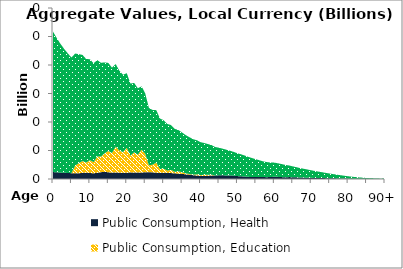
| Category | Public Consumption, Health | Public Consumption, Education | Public Consumption, Other than health and education |
|---|---|---|---|
| 0 | 1.221 | 0 | 24.641 |
|  | 1.171 | 0 | 23.57 |
| 2 | 1.126 | 0 | 22.611 |
| 3 | 1.087 | 0 | 21.753 |
| 4 | 1.067 | 0 | 20.986 |
| 5 | 1.02 | 0 | 20.3 |
| 6 | 1.003 | 1.318 | 19.684 |
| 7 | 1 | 1.787 | 19.128 |
| 8 | 1.085 | 2.061 | 18.621 |
| 9 | 1.122 | 1.768 | 18.153 |
| 10 | 1.057 | 2.241 | 17.725 |
| 11 | 1 | 1.965 | 17.337 |
| 12 | 1.085 | 2.858 | 16.922 |
| 13 | 1.2 | 2.738 | 16.449 |
| 14 | 1.243 | 3.277 | 15.94 |
| 15 | 1.183 | 3.729 | 15.45 |
| 16 | 1.115 | 3.448 | 14.967 |
| 17 | 1.148 | 4.529 | 14.489 |
| 18 | 1.109 | 3.857 | 14.021 |
| 19 | 1.1 | 3.636 | 13.558 |
| 20 | 1.094 | 4.378 | 13.097 |
| 21 | 1.166 | 2.923 | 12.647 |
| 22 | 1.13 | 3.562 | 12.172 |
| 23 | 1.146 | 3.115 | 11.655 |
| 24 | 1.144 | 4.003 | 11.118 |
| 25 | 1.182 | 3.258 | 10.595 |
| 26 | 1.207 | 1.177 | 10.077 |
| 27 | 1.164 | 1.351 | 9.605 |
| 28 | 1.111 | 1.762 | 9.203 |
| 29 | 1.07 | 0.695 | 8.852 |
| 30 | 1.099 | 0.703 | 8.508 |
| 31 | 1.073 | 0.415 | 8.179 |
| 32 | 1.035 | 0.565 | 7.863 |
| 33 | 1.012 | 0.234 | 7.554 |
| 34 | 0.924 | 0.412 | 7.255 |
| 35 | 0.903 | 0.274 | 6.973 |
| 36 | 0.815 | 0.174 | 6.706 |
| 37 | 0.766 | 0.107 | 6.454 |
| 38 | 0.671 | 0.092 | 6.216 |
| 39 | 0.618 | 0.197 | 5.99 |
| 40 | 0.562 | 0.126 | 5.774 |
| 41 | 0.538 | 0.212 | 5.567 |
| 42 | 0.571 | 0.186 | 5.371 |
| 43 | 0.618 | 0.14 | 5.186 |
| 44 | 0.595 | 0 | 5.01 |
| 45 | 0.651 | 0 | 4.839 |
| 46 | 0.644 | 0 | 4.674 |
| 47 | 0.627 | 0 | 4.509 |
| 48 | 0.62 | 0 | 4.341 |
| 49 | 0.58 | 0 | 4.172 |
| 50 | 0.509 | 0 | 4.008 |
| 51 | 0.473 | 0 | 3.853 |
| 52 | 0.43 | 0 | 3.685 |
| 53 | 0.374 | 0 | 3.498 |
| 54 | 0.363 | 0 | 3.301 |
| 55 | 0.366 | 0 | 3.11 |
| 56 | 0.365 | 0 | 2.917 |
| 57 | 0.332 | 0 | 2.754 |
| 58 | 0.326 | 0 | 2.638 |
| 59 | 0.338 | 0 | 2.552 |
| 60 | 0.405 | 0 | 2.465 |
| 61 | 0.373 | 0 | 2.383 |
| 62 | 0.33 | 0 | 2.289 |
| 63 | 0.303 | 0 | 2.17 |
| 64 | 0.335 | 0 | 2.036 |
| 65 | 0.31 | 0 | 1.908 |
| 66 | 0.29 | 0 | 1.784 |
| 67 | 0.25 | 0 | 1.663 |
| 68 | 0.242 | 0 | 1.548 |
| 69 | 0.221 | 0 | 1.437 |
| 70 | 0.203 | 0 | 1.328 |
| 71 | 0.187 | 0 | 1.221 |
| 72 | 0.178 | 0 | 1.116 |
| 73 | 0.167 | 0 | 1.015 |
| 74 | 0.151 | 0 | 0.917 |
| 75 | 0.135 | 0 | 0.822 |
| 76 | 0.12 | 0 | 0.732 |
| 77 | 0.106 | 0 | 0.646 |
| 78 | 0.093 | 0 | 0.565 |
| 79 | 0.08 | 0 | 0.489 |
| 80 | 0.068 | 0 | 0.417 |
| 81 | 0.057 | 0 | 0.349 |
| 82 | 0.048 | 0 | 0.289 |
| 83 | 0.039 | 0 | 0.238 |
| 84 | 0.032 | 0 | 0.193 |
| 85 | 0.025 | 0 | 0.153 |
| 86 | 0.019 | 0 | 0.117 |
| 87 | 0.014 | 0 | 0.088 |
| 88 | 0.011 | 0 | 0.065 |
| 89 | 0.008 | 0 | 0.048 |
| 90+ | 0.016 | 0 | 0.1 |